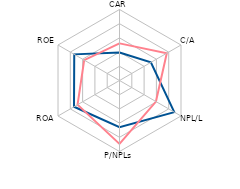
| Category | Serbia | Region |
|---|---|---|
| CAR | 1.967 | 2.614 |
| C/A | 2.55 | 3.845 |
| NPL/L | 4.453 | 2.963 |
| P/NPLs | 3.288 | 4.464 |
| ROA | 3.7 | 3.41 |
| ROE | 3.68 | 2.872 |